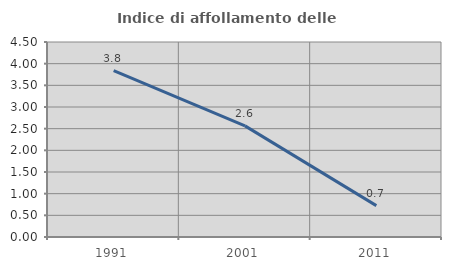
| Category | Indice di affollamento delle abitazioni  |
|---|---|
| 1991.0 | 3.838 |
| 2001.0 | 2.564 |
| 2011.0 | 0.725 |